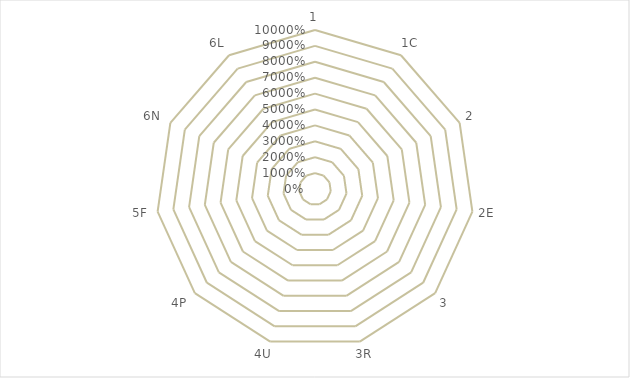
| Category | Series 0 |
|---|---|
| 1 | 0 |
| 1C | 0 |
| 2 | 0 |
| 2E | 0 |
| 3 | 0 |
| 3R | 0 |
| 4U | 0 |
| 4P | 0 |
| 5F | 0 |
| 6N | 0 |
| 6L | 0 |